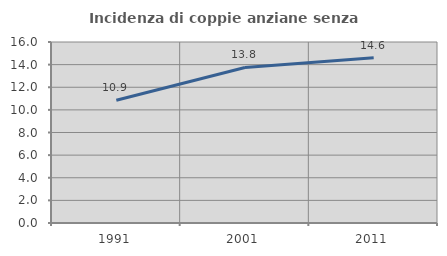
| Category | Incidenza di coppie anziane senza figli  |
|---|---|
| 1991.0 | 10.856 |
| 2001.0 | 13.751 |
| 2011.0 | 14.613 |